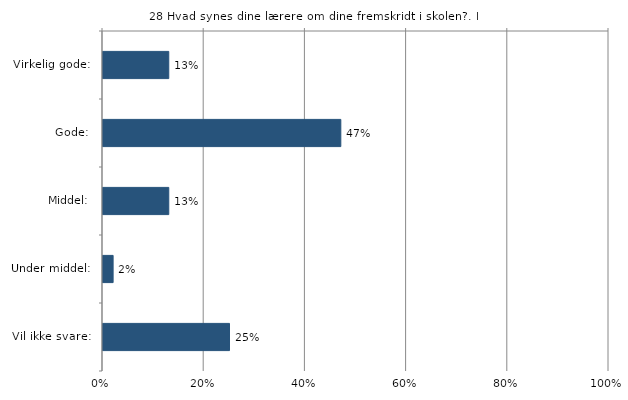
| Category | Hvad synes dine lærere om dine fremskridt i skolen? |
|---|---|
| Virkelig gode:  | 0.13 |
| Gode:  | 0.47 |
| Middel:  | 0.13 |
| Under middel:  | 0.02 |
| Vil ikke svare:  | 0.25 |